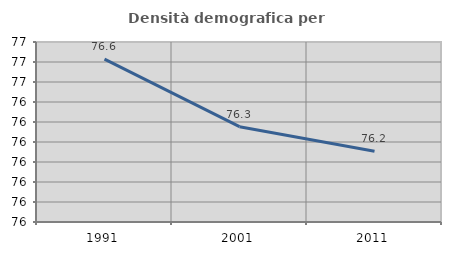
| Category | Densità demografica |
|---|---|
| 1991.0 | 76.614 |
| 2001.0 | 76.277 |
| 2011.0 | 76.154 |